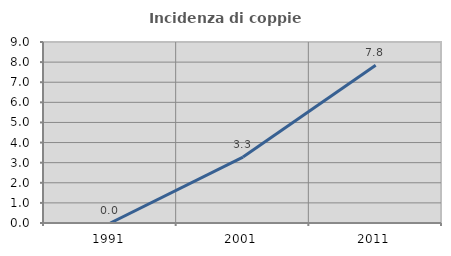
| Category | Incidenza di coppie miste |
|---|---|
| 1991.0 | 0 |
| 2001.0 | 3.279 |
| 2011.0 | 7.843 |